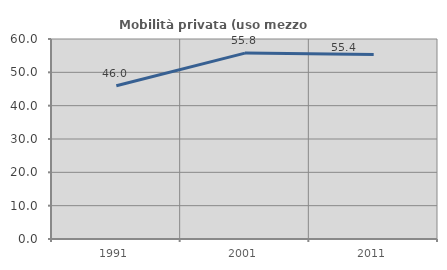
| Category | Mobilità privata (uso mezzo privato) |
|---|---|
| 1991.0 | 45.96 |
| 2001.0 | 55.773 |
| 2011.0 | 55.357 |